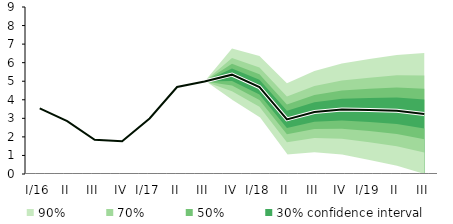
| Category | linka | Střed předpovědi |
|---|---|---|
| I/16 | 3.541 | 3.541 |
| II | 2.848 | 2.848 |
| III | 1.844 | 1.844 |
| IV | 1.766 | 1.766 |
| I/17 | 2.992 | 2.992 |
| II | 4.69 | 4.69 |
| III | 4.984 | 4.984 |
| IV | 5.354 | 5.354 |
| I/18 | 4.682 | 4.682 |
| II | 2.944 | 2.944 |
| III | 3.336 | 3.336 |
| IV | 3.472 | 3.472 |
| I/19 | 3.449 | 3.449 |
| II | 3.406 | 3.406 |
| III | 3.235 | 3.235 |